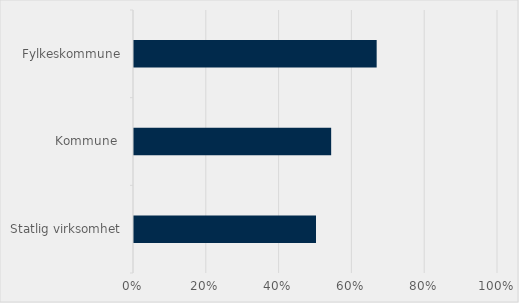
| Category | Series 0 |
|---|---|
| Statlig virksomhet | 0.5 |
| Kommune  | 0.542 |
| Fylkeskommune | 0.667 |